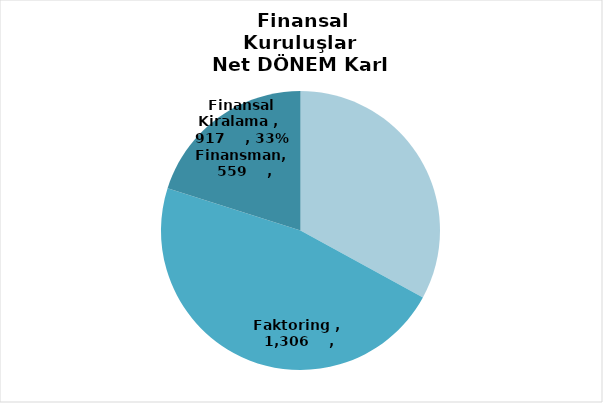
| Category | Series 0 |
|---|---|
| Finansal Kiralama  | 917 |
| Faktoring  | 1306 |
| Finansman | 559 |